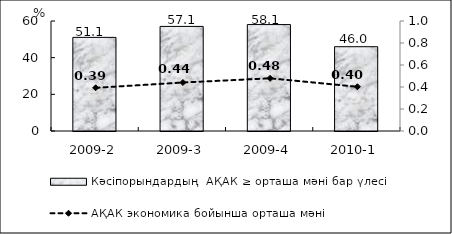
| Category | Кәсіпорындардың  АҚАК ≥ орташа мәні бар үлесі  |
|---|---|
| 2009-2 | 51.06 |
| 2009-3 | 57.05 |
| 2009-4 | 58.05 |
| 2010-1 | 45.98 |